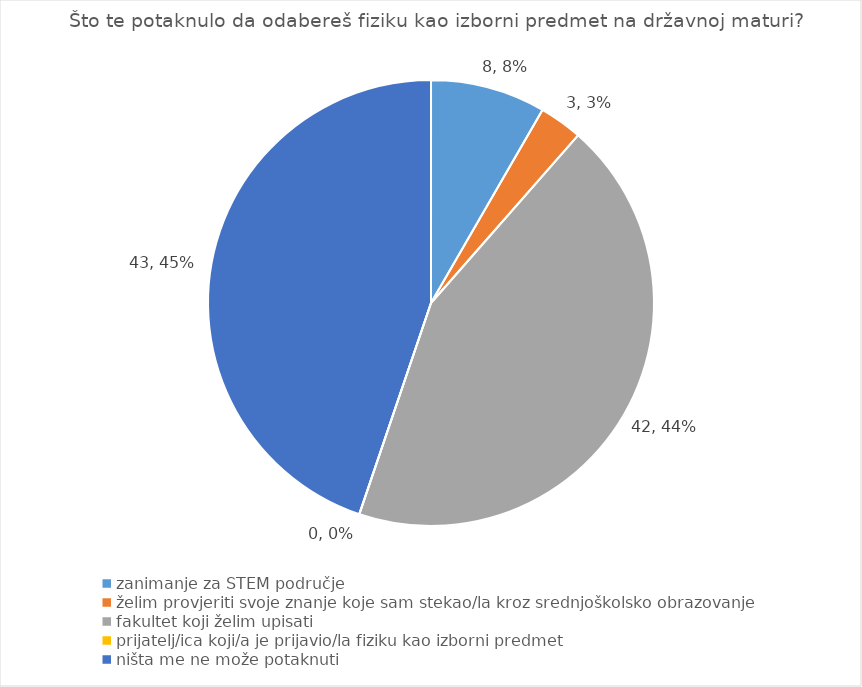
| Category | Series 0 |
|---|---|
| zanimanje za STEM područje | 8 |
| želim provjeriti svoje znanje koje sam stekao/la kroz srednjoškolsko obrazovanje | 3 |
| fakultet koji želim upisati  | 42 |
| prijatelj/ica koji/a je prijavio/la fiziku kao izborni predmet | 0 |
| ništa me ne može potaknuti | 43 |